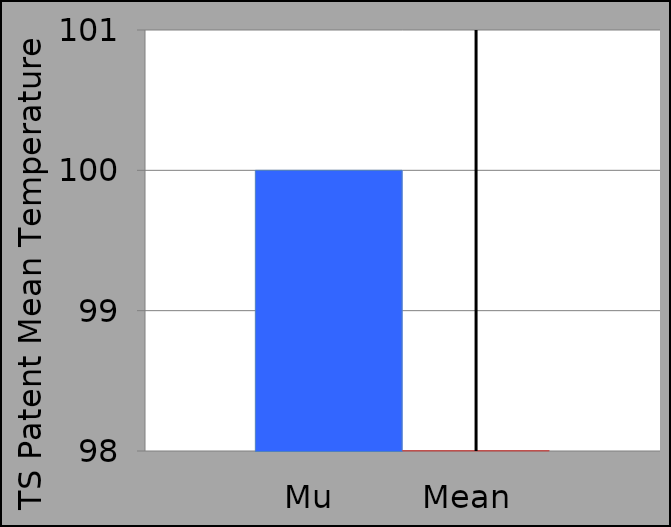
| Category | mu | M |
|---|---|---|
|  | 100 | 97.88 |